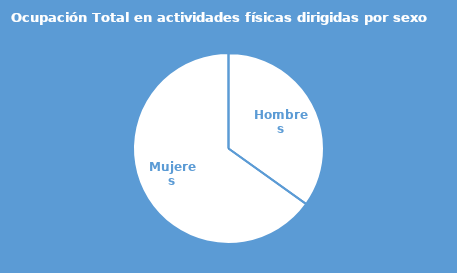
| Category | Series 0 |
|---|---|
| Hombres | 0.349 |
| Mujeres | 0.651 |